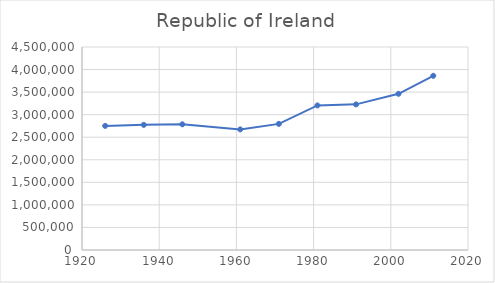
| Category | Series 0 |
|---|---|
| 1926.0 | 2751269 |
| 1936.0 | 2773920 |
| 1946.0 | 2786033 |
| 1961.0 | 2673473 |
| 1971.0 | 2795666 |
| 1981.0 | 3204476 |
| 1991.0 | 3228327 |
| 2002.0 | 3462606 |
| 2011.0 | 3861335 |